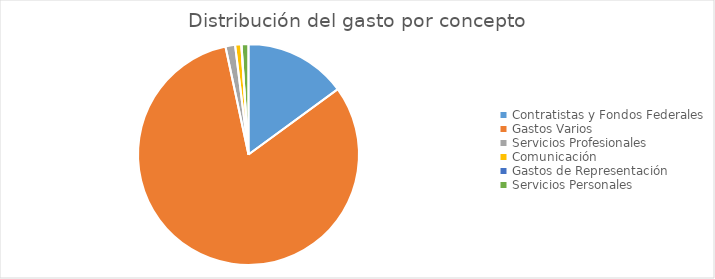
| Category | Series 0 |
|---|---|
| Contratistas y Fondos Federales | 63667832.14 |
| Gastos Varios | 348029756.3 |
| Servicios Profesionales | 5987993.69 |
| Comunicación | 3844350.36 |
| Gastos de Representación | 136540.12 |
| Servicios Personales | 4300365.9 |